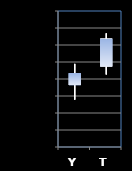
| Category | Series 0 | Series 1 | Series 2 | Series 3 |
|---|---|---|---|---|
| Y | 131.328 | 131.578 | 131.156 | 131.469 |
| T | 131.547 | 131.938 | 131.453 | 131.875 |